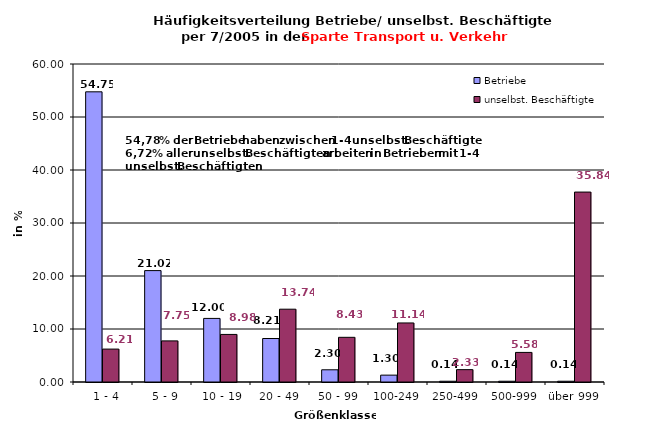
| Category | Betriebe | unselbst. Beschäftigte |
|---|---|---|
|   1 - 4 | 54.75 | 6.209 |
|   5 - 9 | 21.017 | 7.754 |
|  10 - 19 | 11.996 | 8.977 |
| 20 - 49 | 8.205 | 13.737 |
| 50 - 99 | 2.303 | 8.431 |
| 100-249 | 1.296 | 11.142 |
| 250-499 | 0.144 | 2.331 |
| 500-999 | 0.144 | 5.583 |
| über 999 | 0.144 | 35.837 |